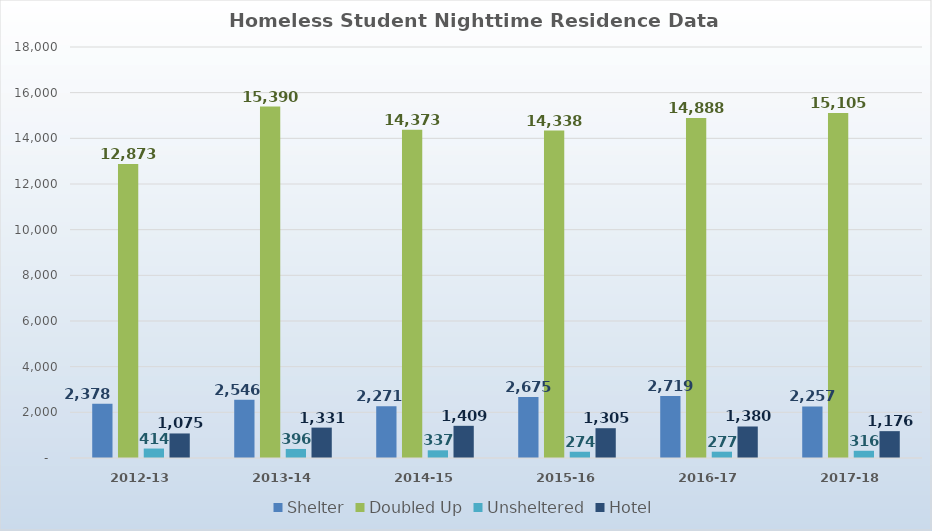
| Category | Shelter | Doubled Up | Unsheltered | Hotel |
|---|---|---|---|---|
| 2012-13 | 2378 | 12873 | 414 | 1075 |
| 2013-14 | 2546 | 15390 | 396 | 1331 |
| 2014-15 | 2271 | 14373 | 337 | 1409 |
| 2015-16 | 2675 | 14338 | 274 | 1305 |
| 2016-17 | 2719 | 14888 | 277 | 1380 |
| 2017-18 | 2257 | 15105 | 316 | 1176 |